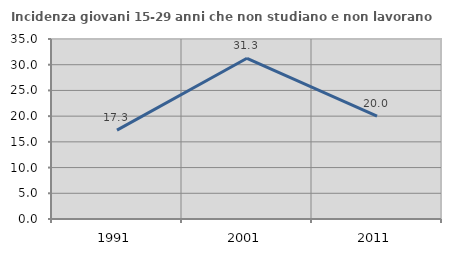
| Category | Incidenza giovani 15-29 anni che non studiano e non lavorano  |
|---|---|
| 1991.0 | 17.288 |
| 2001.0 | 31.25 |
| 2011.0 | 20 |